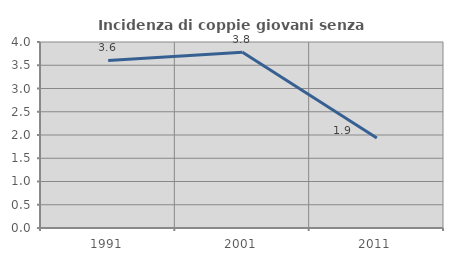
| Category | Incidenza di coppie giovani senza figli |
|---|---|
| 1991.0 | 3.604 |
| 2001.0 | 3.78 |
| 2011.0 | 1.937 |